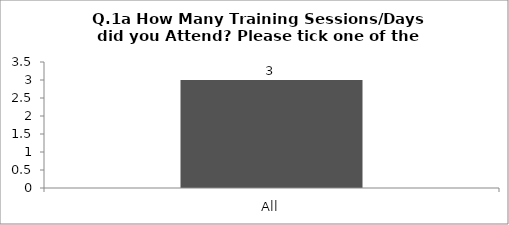
| Category | Q.1a How Many Training Sessions/Days did you Attend? Please tick one of the answers below |
|---|---|
| All | 3 |